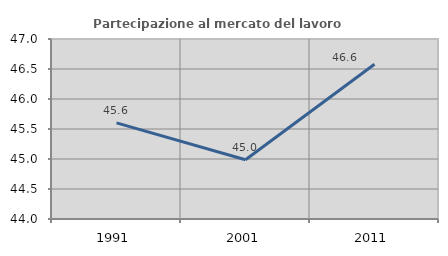
| Category | Partecipazione al mercato del lavoro  femminile |
|---|---|
| 1991.0 | 45.602 |
| 2001.0 | 44.987 |
| 2011.0 | 46.579 |